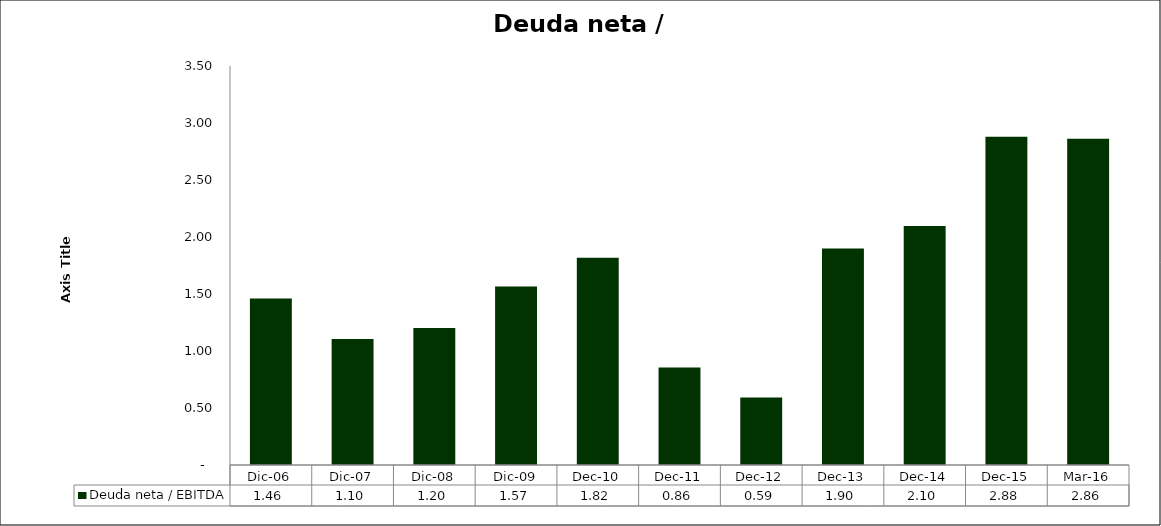
| Category | Deuda neta / EBITDA |
|---|---|
| Dic-06 | 1.461 |
| Dic-07 | 1.104 |
| Dic-08 | 1.202 |
| Dic-09 | 1.565 |
| dic-10 | 1.817 |
| dic-11 | 0.856 |
| dic-12 | 0.593 |
| dic-13 | 1.899 |
| dic-14 | 2.097 |
| dic-15 | 2.879 |
| mar-16 | 2.861 |